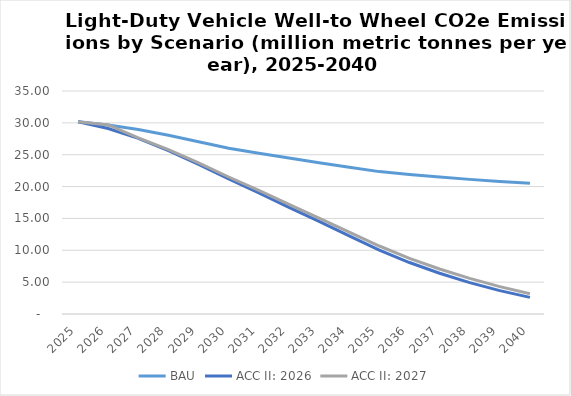
| Category | BAU | ACC II: 2026 | ACC II: 2027 |
|---|---|---|---|
| 2025.0 | 30.172 | 30.172 | 30.172 |
| 2026.0 | 29.674 | 29.12 | 29.674 |
| 2027.0 | 28.967 | 27.567 | 27.637 |
| 2028.0 | 28.064 | 25.651 | 25.798 |
| 2029.0 | 27.033 | 23.481 | 23.708 |
| 2030.0 | 26.011 | 21.193 | 21.502 |
| 2031.0 | 25.243 | 18.999 | 19.393 |
| 2032.0 | 24.475 | 16.745 | 17.218 |
| 2033.0 | 23.732 | 14.524 | 15.063 |
| 2034.0 | 23.017 | 12.251 | 12.846 |
| 2035.0 | 22.347 | 10.035 | 10.673 |
| 2036.0 | 21.896 | 8.077 | 8.742 |
| 2037.0 | 21.491 | 6.393 | 7.061 |
| 2038.0 | 21.129 | 4.93 | 5.584 |
| 2039.0 | 20.808 | 3.673 | 4.292 |
| 2040.0 | 20.532 | 2.61 | 3.173 |